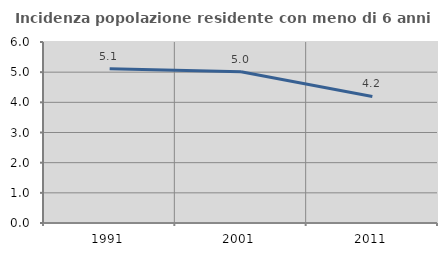
| Category | Incidenza popolazione residente con meno di 6 anni |
|---|---|
| 1991.0 | 5.117 |
| 2001.0 | 5.012 |
| 2011.0 | 4.194 |